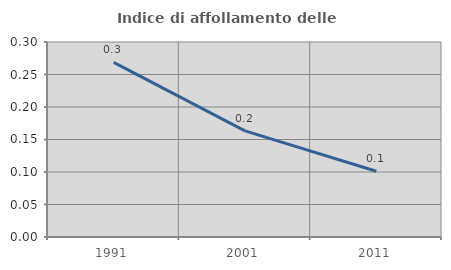
| Category | Indice di affollamento delle abitazioni  |
|---|---|
| 1991.0 | 0.269 |
| 2001.0 | 0.163 |
| 2011.0 | 0.101 |